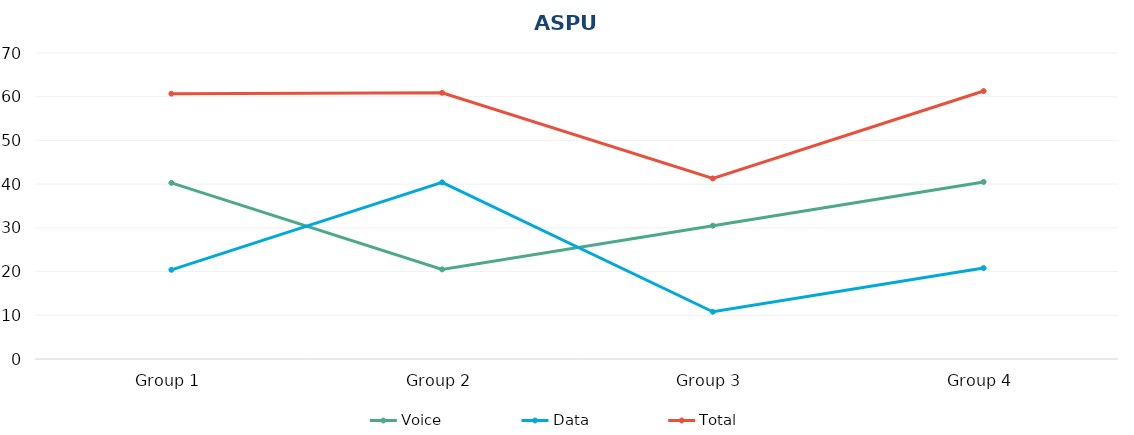
| Category | Voice | Data | Total |
|---|---|---|---|
| Group 1 | 40.3 | 20.4 | 60.7 |
| Group 2 | 20.5 | 40.4 | 60.9 |
| Group 3 | 30.5 | 10.8 | 41.3 |
| Group 4 | 40.5 | 20.8 | 61.3 |